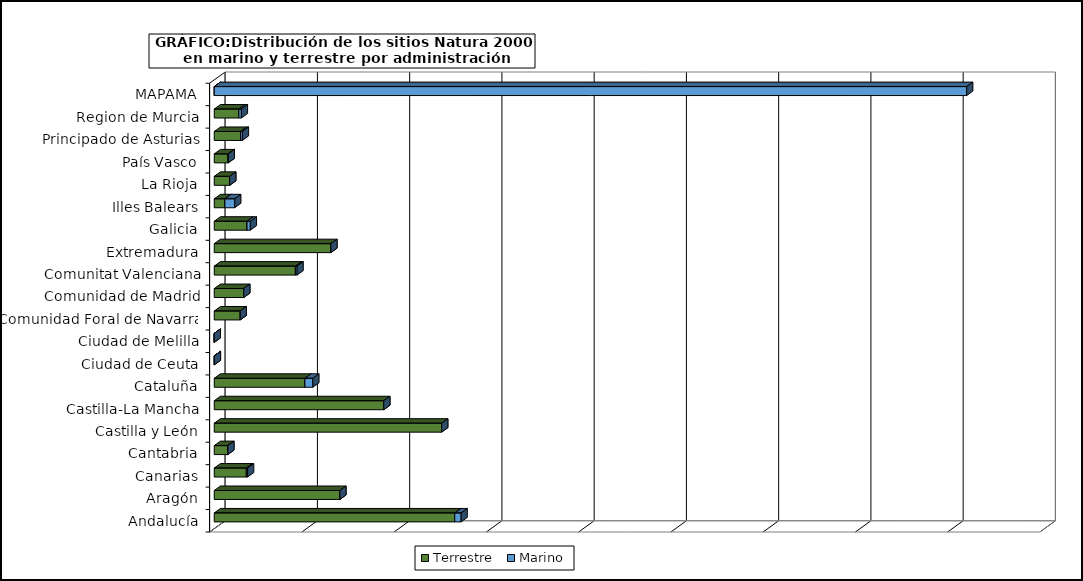
| Category | Terrestre | Marino |
|---|---|---|
| Andalucía | 2607043.241 | 68807.403 |
| Aragón | 1361299.304 | 0 |
| Canarias | 347952.331 | 13358.285 |
| Cantabria | 145807.759 | 1855.503 |
| Castilla y León | 2464997.994 | 0 |
| Castilla-La Mancha | 1837533.499 | 0 |
| Cataluña | 982693.252 | 85917.431 |
| Ciudad de Ceuta | 630.53 | 836.2 |
| Ciudad de Melilla | 46.119 | 45.461 |
| Comunidad Foral de Navarra | 280949.967 | 0 |
| Comunidad de Madrid | 319478.643 | 0 |
| Comunitat Valenciana | 879794.224 | 17873.356 |
| Extremadura | 1263943.173 | 0 |
| Galicia | 355283.413 | 35653.308 |
| Illes Balears | 115437.066 | 106462.594 |
| La Rioja | 167545.786 | 0 |
| País Vasco | 150391.473 | 1443.252 |
| Principado de Asturias | 285027.075 | 19813.201 |
| Region de Murcia | 266747.568 | 27070.029 |
| MAPAMA | 532.342 | 8155583.532 |